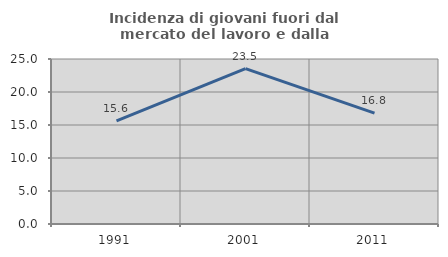
| Category | Incidenza di giovani fuori dal mercato del lavoro e dalla formazione  |
|---|---|
| 1991.0 | 15.613 |
| 2001.0 | 23.548 |
| 2011.0 | 16.799 |